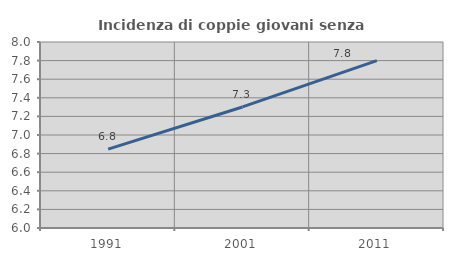
| Category | Incidenza di coppie giovani senza figli |
|---|---|
| 1991.0 | 6.848 |
| 2001.0 | 7.302 |
| 2011.0 | 7.8 |